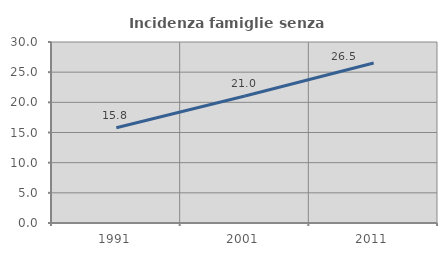
| Category | Incidenza famiglie senza nuclei |
|---|---|
| 1991.0 | 15.799 |
| 2001.0 | 21.042 |
| 2011.0 | 26.508 |